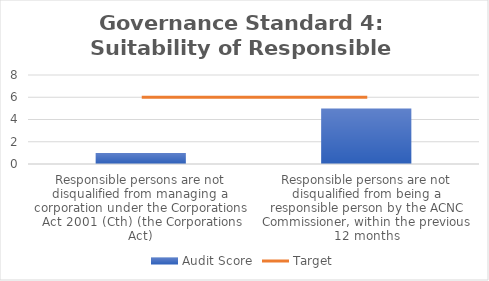
| Category | Audit Score |
|---|---|
| Responsible persons are not disqualified from managing a corporation under the Corporations Act 2001 (Cth) (the Corporations Act) | 1 |
| Responsible persons are not disqualified from being a responsible person by the ACNC Commissioner, within the previous 12 months | 5 |